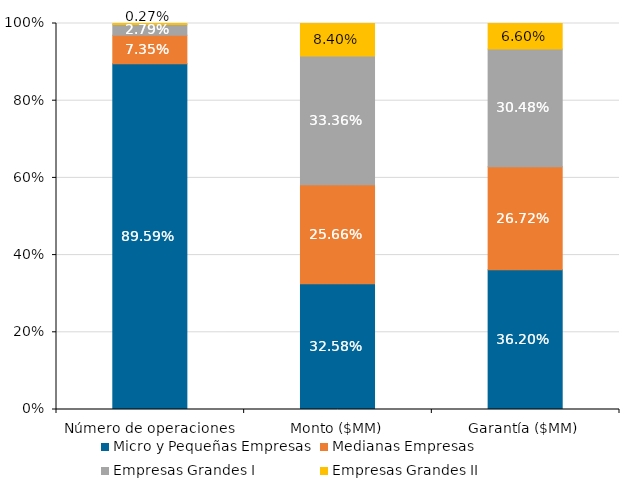
| Category | Micro y Pequeñas Empresas | Medianas Empresas | Empresas Grandes I | Empresas Grandes II |
|---|---|---|---|---|
| Número de operaciones | 0.896 | 0.074 | 0.028 | 0.003 |
| Monto ($MM) | 0.326 | 0.257 | 0.334 | 0.084 |
| Garantía ($MM) | 0.362 | 0.267 | 0.305 | 0.066 |